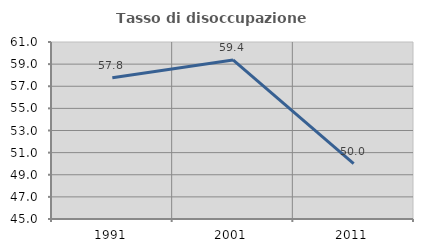
| Category | Tasso di disoccupazione giovanile  |
|---|---|
| 1991.0 | 57.778 |
| 2001.0 | 59.375 |
| 2011.0 | 50 |